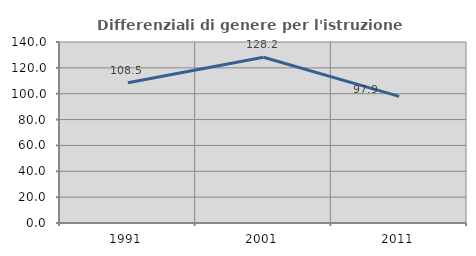
| Category | Differenziali di genere per l'istruzione superiore |
|---|---|
| 1991.0 | 108.475 |
| 2001.0 | 128.205 |
| 2011.0 | 97.897 |